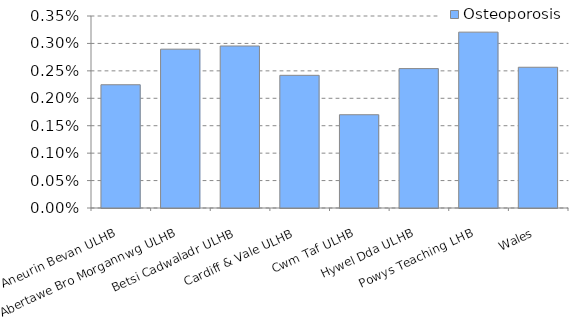
| Category | Osteoporosis |
|---|---|
| Aneurin Bevan ULHB | 0.002 |
| Abertawe Bro Morgannwg ULHB | 0.003 |
| Betsi Cadwaladr ULHB | 0.003 |
| Cardiff & Vale ULHB | 0.002 |
| Cwm Taf ULHB | 0.002 |
| Hywel Dda ULHB | 0.003 |
| Powys Teaching LHB | 0.003 |
| Wales | 0.003 |